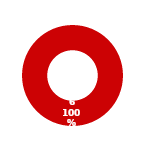
| Category | RM |
|---|---|
| MIL 3 Complete | 0 |
| MIL 3 Not Complete | 6 |